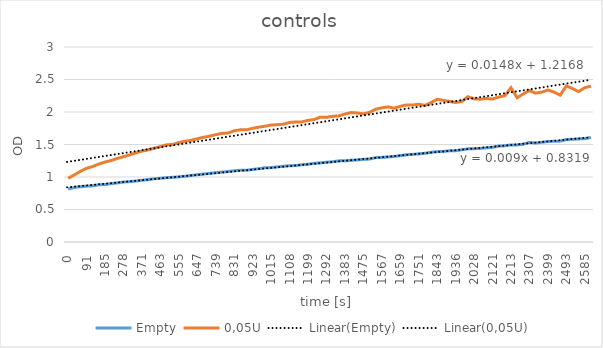
| Category | Empty | 0,05U |
|---|---|---|
| 0.0 | 0.815 | 0.98 |
| 30.0 | 0.839 | 1.032 |
| 61.0 | 0.85 | 1.086 |
| 91.0 | 0.859 | 1.134 |
| 122.0 | 0.864 | 1.161 |
| 153.0 | 0.881 | 1.2 |
| 185.0 | 0.884 | 1.23 |
| 216.0 | 0.898 | 1.254 |
| 246.0 | 0.909 | 1.286 |
| 278.0 | 0.922 | 1.312 |
| 309.0 | 0.929 | 1.339 |
| 341.0 | 0.938 | 1.371 |
| 371.0 | 0.95 | 1.397 |
| 402.0 | 0.96 | 1.417 |
| 432.0 | 0.972 | 1.442 |
| 463.0 | 0.98 | 1.468 |
| 494.0 | 0.99 | 1.495 |
| 525.0 | 0.995 | 1.501 |
| 555.0 | 1.002 | 1.529 |
| 586.0 | 1.012 | 1.55 |
| 617.0 | 1.023 | 1.564 |
| 647.0 | 1.034 | 1.588 |
| 678.0 | 1.045 | 1.611 |
| 708.0 | 1.055 | 1.628 |
| 739.0 | 1.066 | 1.651 |
| 770.0 | 1.075 | 1.67 |
| 800.0 | 1.084 | 1.677 |
| 831.0 | 1.095 | 1.71 |
| 862.0 | 1.104 | 1.726 |
| 893.0 | 1.103 | 1.725 |
| 923.0 | 1.117 | 1.749 |
| 954.0 | 1.128 | 1.767 |
| 985.0 | 1.142 | 1.781 |
| 1015.0 | 1.145 | 1.799 |
| 1046.0 | 1.155 | 1.805 |
| 1076.0 | 1.165 | 1.812 |
| 1108.0 | 1.173 | 1.839 |
| 1139.0 | 1.176 | 1.846 |
| 1169.0 | 1.189 | 1.848 |
| 1199.0 | 1.196 | 1.871 |
| 1230.0 | 1.21 | 1.884 |
| 1261.0 | 1.217 | 1.921 |
| 1292.0 | 1.227 | 1.917 |
| 1323.0 | 1.234 | 1.934 |
| 1353.0 | 1.248 | 1.94 |
| 1383.0 | 1.249 | 1.968 |
| 1414.0 | 1.257 | 1.992 |
| 1444.0 | 1.263 | 1.985 |
| 1475.0 | 1.271 | 1.971 |
| 1505.0 | 1.276 | 1.993 |
| 1536.0 | 1.298 | 2.043 |
| 1567.0 | 1.302 | 2.064 |
| 1598.0 | 1.308 | 2.079 |
| 1629.0 | 1.316 | 2.059 |
| 1659.0 | 1.329 | 2.087 |
| 1690.0 | 1.342 | 2.109 |
| 1720.0 | 1.348 | 2.107 |
| 1751.0 | 1.356 | 2.12 |
| 1782.0 | 1.365 | 2.101 |
| 1813.0 | 1.38 | 2.143 |
| 1843.0 | 1.39 | 2.195 |
| 1874.0 | 1.393 | 2.179 |
| 1905.0 | 1.403 | 2.162 |
| 1936.0 | 1.405 | 2.146 |
| 1967.0 | 1.419 | 2.16 |
| 1997.0 | 1.433 | 2.236 |
| 2028.0 | 1.435 | 2.202 |
| 2059.0 | 1.44 | 2.197 |
| 2090.0 | 1.449 | 2.208 |
| 2121.0 | 1.456 | 2.199 |
| 2151.0 | 1.475 | 2.23 |
| 2182.0 | 1.48 | 2.25 |
| 2213.0 | 1.494 | 2.374 |
| 2244.0 | 1.494 | 2.219 |
| 2276.0 | 1.504 | 2.279 |
| 2307.0 | 1.532 | 2.33 |
| 2337.0 | 1.522 | 2.29 |
| 2368.0 | 1.535 | 2.305 |
| 2399.0 | 1.545 | 2.338 |
| 2431.0 | 1.55 | 2.307 |
| 2462.0 | 1.552 | 2.259 |
| 2493.0 | 1.576 | 2.4 |
| 2523.0 | 1.581 | 2.361 |
| 2554.0 | 1.586 | 2.314 |
| 2585.0 | 1.589 | 2.375 |
| 2616.0 | 1.608 | 2.397 |